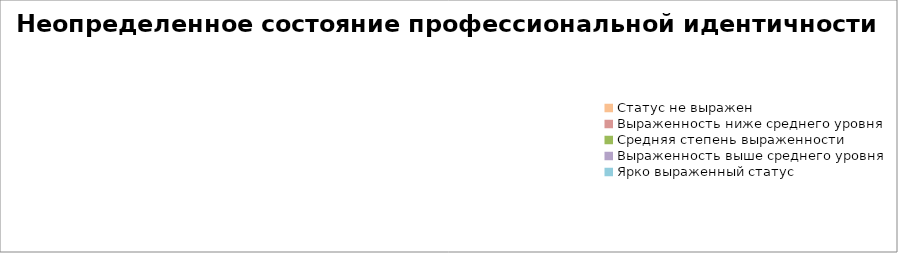
| Category | Series 0 |
|---|---|
| Статус не выражен | 0 |
| Выраженность ниже среднего уровня | 0 |
| Средняя степень выраженности | 0 |
| Выраженность выше среднего уровня | 0 |
| Ярко выраженный статус | 0 |